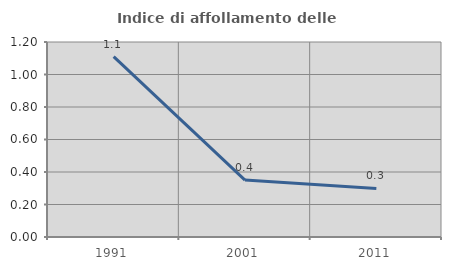
| Category | Indice di affollamento delle abitazioni  |
|---|---|
| 1991.0 | 1.11 |
| 2001.0 | 0.351 |
| 2011.0 | 0.299 |